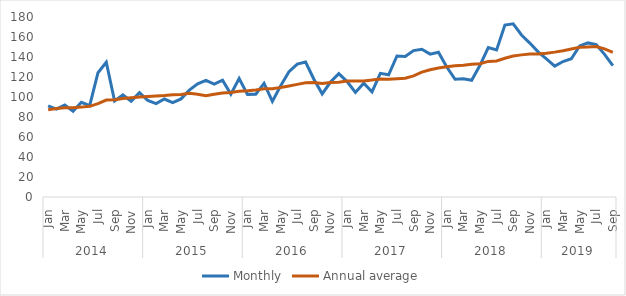
| Category | Monthly | Annual average |
|---|---|---|
| 0 | 91.172 | 87.258 |
| 1 | 87.795 | 88.6 |
| 2 | 91.925 | 89.367 |
| 3 | 85.793 | 89.314 |
| 4 | 94.702 | 89.879 |
| 5 | 91.375 | 90.649 |
| 6 | 124.243 | 93.285 |
| 7 | 134.751 | 96.991 |
| 8 | 96.05 | 97.232 |
| 9 | 102.032 | 98.524 |
| 10 | 95.842 | 99.319 |
| 11 | 104.32 | 100 |
| 12 | 96.525 | 100.446 |
| 13 | 93.393 | 100.913 |
| 14 | 97.959 | 101.415 |
| 15 | 94.356 | 102.129 |
| 16 | 98.093 | 102.412 |
| 17 | 106.814 | 103.698 |
| 18 | 113.212 | 102.779 |
| 19 | 116.54 | 101.261 |
| 20 | 112.953 | 102.67 |
| 21 | 116.784 | 103.899 |
| 22 | 102.901 | 104.488 |
| 23 | 118.434 | 105.664 |
| 24 | 102.639 | 106.173 |
| 25 | 102.81 | 106.958 |
| 26 | 113.562 | 108.258 |
| 27 | 95.519 | 108.355 |
| 28 | 111.187 | 109.446 |
| 29 | 125.368 | 110.992 |
| 30 | 132.853 | 112.629 |
| 31 | 135.013 | 114.169 |
| 32 | 117.791 | 114.572 |
| 33 | 103.136 | 113.434 |
| 34 | 114.985 | 114.441 |
| 35 | 123.408 | 114.856 |
| 36 | 115.412 | 115.92 |
| 37 | 104.485 | 116.06 |
| 38 | 113.825 | 116.082 |
| 39 | 105.211 | 116.89 |
| 40 | 123.659 | 117.929 |
| 41 | 122.192 | 117.664 |
| 42 | 140.996 | 118.343 |
| 43 | 140.454 | 118.796 |
| 44 | 146.37 | 121.178 |
| 45 | 147.791 | 124.899 |
| 46 | 142.845 | 127.221 |
| 47 | 144.734 | 128.998 |
| 48 | 129.971 | 130.211 |
| 49 | 117.721 | 131.314 |
| 50 | 118.31 | 131.688 |
| 51 | 116.791 | 132.653 |
| 52 | 131.732 | 133.326 |
| 53 | 149.357 | 135.589 |
| 54 | 147.046 | 136.094 |
| 55 | 171.905 | 138.714 |
| 56 | 173.192 | 140.95 |
| 57 | 161.986 | 142.132 |
| 58 | 153.917 | 143.055 |
| 59 | 145.117 | 143.087 |
| 60 | 138.119 | 143.766 |
| 61 | 130.858 | 144.861 |
| 62 | 135.482 | 146.292 |
| 63 | 138.236 | 148.079 |
| 64 | 151.054 | 149.689 |
| 65 | 154.087 | 150.083 |
| 66 | 152.354 | 150.526 |
| 67 | 142.661 | 148.089 |
| 68 | 131.329 | 144.6 |